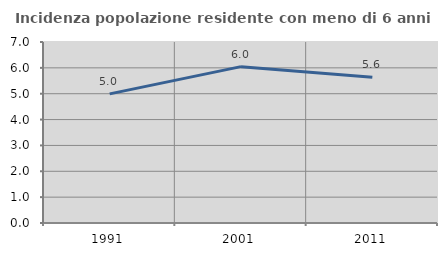
| Category | Incidenza popolazione residente con meno di 6 anni |
|---|---|
| 1991.0 | 4.994 |
| 2001.0 | 6.047 |
| 2011.0 | 5.634 |